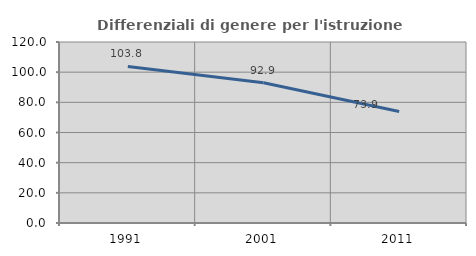
| Category | Differenziali di genere per l'istruzione superiore |
|---|---|
| 1991.0 | 103.832 |
| 2001.0 | 92.923 |
| 2011.0 | 73.895 |